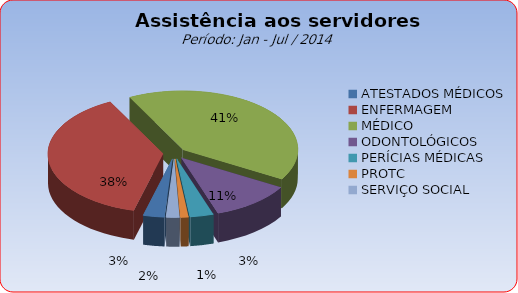
| Category | Series 0 |
|---|---|
| ATESTADOS MÉDICOS | 2.972 |
| ENFERMAGEM | 38.31 |
| MÉDICO | 41.048 |
| ODONTOLÓGICOS | 11.421 |
| PERÍCIAS MÉDICAS | 3.3 |
| PROTC | 1.1 |
| SERVIÇO SOCIAL | 1.849 |